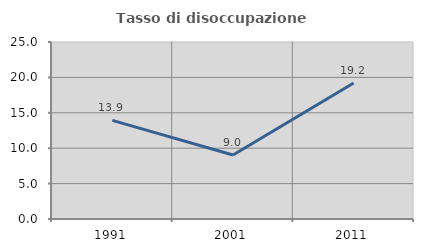
| Category | Tasso di disoccupazione giovanile  |
|---|---|
| 1991.0 | 13.93 |
| 2001.0 | 9.045 |
| 2011.0 | 19.198 |